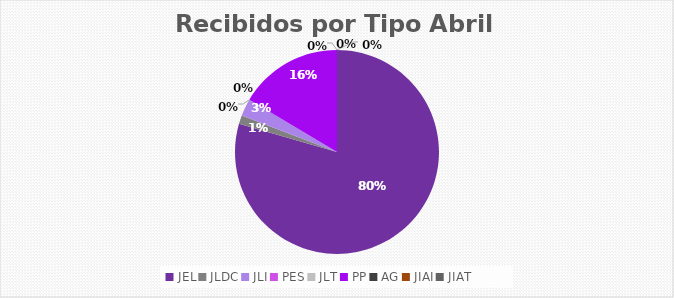
| Category | Series 0 |
|---|---|
| JEL | 58 |
| JLDC | 1 |
| JLI | 2 |
| PES | 0 |
| JLT | 0 |
| PP | 12 |
| AG | 0 |
| JIAI | 0 |
| JIAT | 0 |